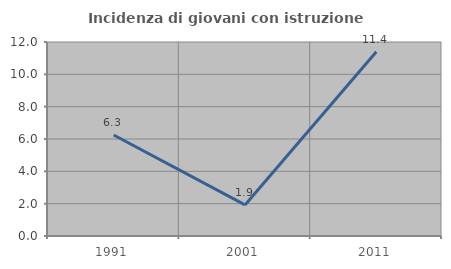
| Category | Incidenza di giovani con istruzione universitaria |
|---|---|
| 1991.0 | 6.25 |
| 2001.0 | 1.923 |
| 2011.0 | 11.392 |